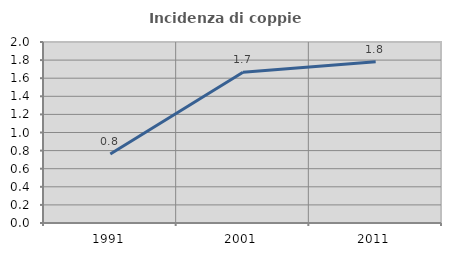
| Category | Incidenza di coppie miste |
|---|---|
| 1991.0 | 0.762 |
| 2001.0 | 1.667 |
| 2011.0 | 1.781 |